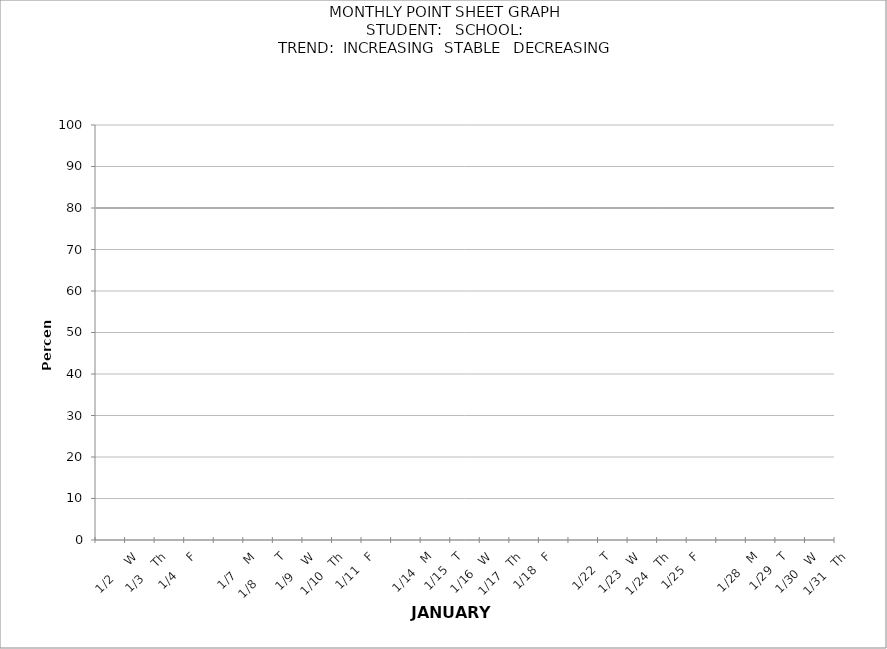
| Category | PERCENTAGE | target |
|---|---|---|
|  |  | 80 |
| 1/2     W |  | 80 |
| 1/3    Th |  | 80 |
| 1/4     F |  | 80 |
|  |  | 80 |
| 1/7    M |  | 80 |
| 1/8        T |  | 80 |
| 1/9    W |  | 80 |
| 1/10   Th |  | 80 |
| 1/11   F |  | 80 |
|  |  | 80 |
| 1/14   M |  | 80 |
| 1/15   T |  | 80 |
| 1/16   W |  | 80 |
| 1/17   Th |  | 80 |
| 1/18   F |  | 80 |
|  |  | 80 |
| 1/22   T |  | 80 |
| 1/23   W |  | 80 |
| 1/24   Th |  | 80 |
| 1/25   F |  | 80 |
|  |  | 80 |
| 1/28   M |  | 80 |
| 1/29   T |  | 80 |
| 1/30   W |  | 80 |
| 1/31   Th |  | 80 |